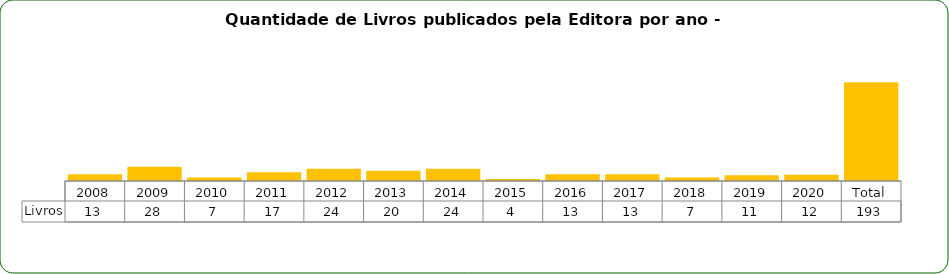
| Category | Livros |
|---|---|
| 2008 | 13 |
| 2009 | 28 |
| 2010 | 7 |
| 2011 | 17 |
| 2012 | 24 |
| 2013 | 20 |
| 2014 | 24 |
| 2015 | 4 |
| 2016 | 13 |
| 2017 | 13 |
| 2018 | 7 |
| 2019 | 11 |
| 2020 | 12 |
| Total | 193 |